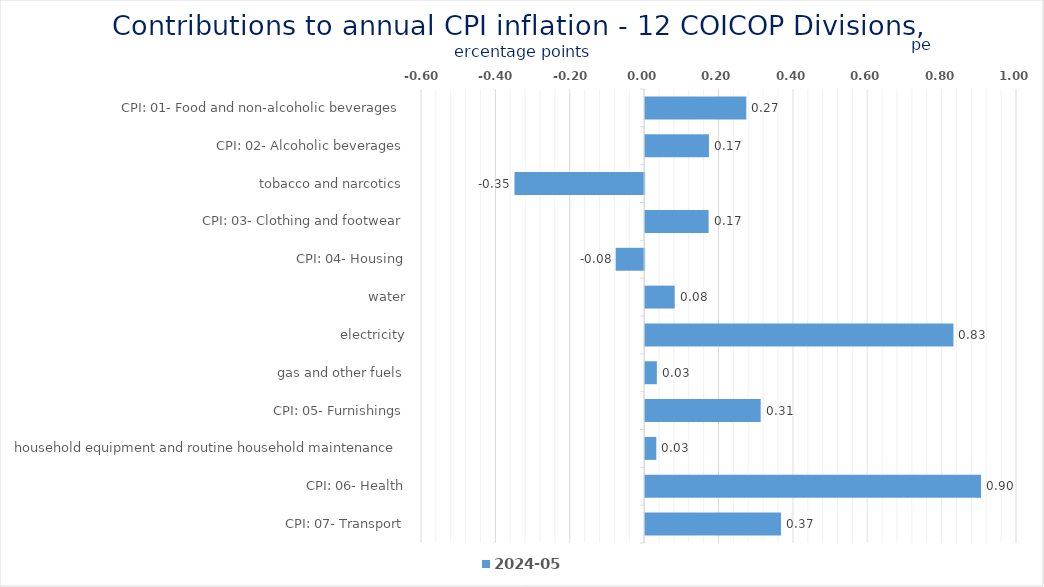
| Category | 2024-05 |
|---|---|
| CPI: 01- Food and non-alcoholic beverages | 0.272 |
| CPI: 02- Alcoholic beverages, tobacco and narcotics | 0.172 |
| CPI: 03- Clothing and footwear | -0.349 |
| CPI: 04- Housing, water, electricity, gas and other fuels | 0.171 |
| CPI: 05- Furnishings, household equipment and routine household maintenance | -0.077 |
| CPI: 06- Health | 0.08 |
| CPI: 07- Transport | 0.829 |
| CPI: 08- Communication | 0.032 |
| CPI: 09- Recreation and culture | 0.311 |
| CPI: 10- Education | 0.03 |
| CPI: 11- Restaurants and hotels | 0.903 |
| CPI: 12- Miscellaneous goods and services | 0.365 |